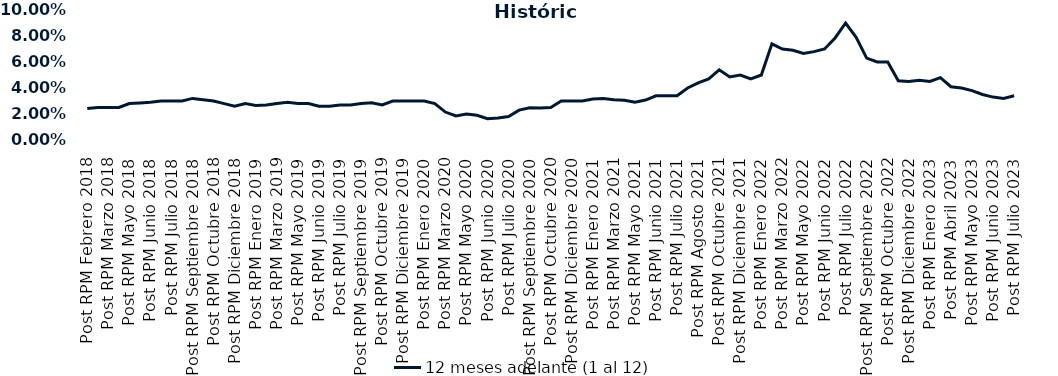
| Category | 12 meses adelante (1 al 12)  |
|---|---|
| Post RPM Febrero 2018 | 0.024 |
| Pre RPM Marzo 2018 | 0.025 |
| Post RPM Marzo 2018 | 0.025 |
| Pre RPM Mayo 2018 | 0.025 |
| Post RPM Mayo 2018 | 0.028 |
| Pre RPM Junio 2018 | 0.028 |
| Post RPM Junio 2018 | 0.029 |
| Pre RPM Julio 2018 | 0.03 |
| Post RPM Julio 2018 | 0.03 |
| Pre RPM Septiembre 2018 | 0.03 |
| Post RPM Septiembre 2018 | 0.032 |
| Pre RPM Octubre 2018 | 0.031 |
| Post RPM Octubre 2018 | 0.03 |
| Pre RPM Diciembre 2018 | 0.028 |
| Post RPM Diciembre 2018 | 0.026 |
| Pre RPM Enero 2019 | 0.028 |
| Post RPM Enero 2019 | 0.026 |
| Pre RPM Marzo 2019 | 0.027 |
| Post RPM Marzo 2019 | 0.028 |
| Pre RPM Mayo 2019 | 0.029 |
| Post RPM Mayo 2019 | 0.028 |
| Pre RPM Junio 2019 | 0.028 |
| Post RPM Junio 2019 | 0.026 |
| Pre RPM Julio 2019 | 0.026 |
| Post RPM Julio 2019 | 0.027 |
| Pre RPM Septiembre 2019 | 0.027 |
| Post RPM Septiembre 2019 | 0.028 |
| Pre RPM Octubre 2019 | 0.029 |
| Post RPM Octubre 2019 | 0.027 |
| Pre RPM Diciembre 2019 | 0.03 |
| Post RPM Diciembre 2019 | 0.03 |
| Pre RPM Enero 2020 | 0.03 |
| Post RPM Enero 2020 | 0.03 |
| Pre RPM Marzo 2020 | 0.028 |
| Post RPM Marzo 2020 | 0.022 |
| Pre RPM Mayo 2020 | 0.018 |
| Post RPM Mayo 2020 | 0.02 |
| Pre RPM Junio 2020 | 0.019 |
| Post RPM Junio 2020 | 0.016 |
| Pre RPM Julio 2020 | 0.017 |
| Post RPM Julio 2020 | 0.018 |
| Pre RPM Septiembre 2020 | 0.023 |
| Post RPM Septiembre 2020 | 0.025 |
| Pre RPM Octubre 2020 | 0.025 |
| Post RPM Octubre 2020 | 0.025 |
| Pre RPM Diciembre 2020 | 0.03 |
| Post RPM Diciembre 2020 | 0.03 |
| Pre RPM Enero 2021 | 0.03 |
| Post RPM Enero 2021 | 0.032 |
| Pre RPM Marzo 2021 | 0.032 |
| Post RPM Marzo 2021 | 0.031 |
| Pre RPM Mayo 2021 | 0.03 |
| Post RPM Mayo 2021 | 0.029 |
| Pre RPM Junio 2021 | 0.031 |
| Post RPM Junio 2021 | 0.034 |
| Pre RPM Julio 2021 | 0.034 |
| Post RPM Julio 2021 | 0.034 |
| Pre RPM Agosto 2021 | 0.04 |
| Post RPM Agosto 2021 | 0.044 |
| Pre RPM Octubre 2021 | 0.047 |
| Post RPM Octubre 2021 | 0.054 |
| Pre RPM Diciembre 2021 | 0.048 |
| Post RPM Diciembre 2021 | 0.05 |
| Pre RPM Enero 2022 | 0.047 |
| Post RPM Enero 2022 | 0.05 |
| Pre RPM Marzo 2022 | 0.074 |
| Post RPM Marzo 2022 | 0.07 |
| Pre RPM Mayo 2022 | 0.069 |
| Post RPM Mayo 2022 | 0.066 |
| Pre RPM Junio 2022 | 0.068 |
| Post RPM Junio 2022 | 0.07 |
| Pre RPM Julio 2022 | 0.078 |
| Post RPM Julio 2022 | 0.09 |
| Pre RPM Septiembre 2022 | 0.079 |
| Post RPM Septiembre 2022 | 0.063 |
| Pre RPM Octubre 2022 | 0.06 |
| Post RPM Octubre 2022 | 0.06 |
| Pre RPM Diciembre 2022 | 0.046 |
| Post RPM Diciembre 2022 | 0.045 |
| Pre RPM Enero 2023 | 0.046 |
| Post RPM Enero 2023 | 0.045 |
| Pre RPM Abril 2023 | 0.048 |
| Post RPM Abril 2023 | 0.041 |
| Pre RPM Mayo 2023 | 0.04 |
| Post RPM Mayo 2023 | 0.038 |
| Pre RPM Junio 2023 | 0.035 |
| Post RPM Junio 2023 | 0.033 |
| Pre RPM Julio 2023 | 0.032 |
| Post RPM Julio 2023 | 0.034 |